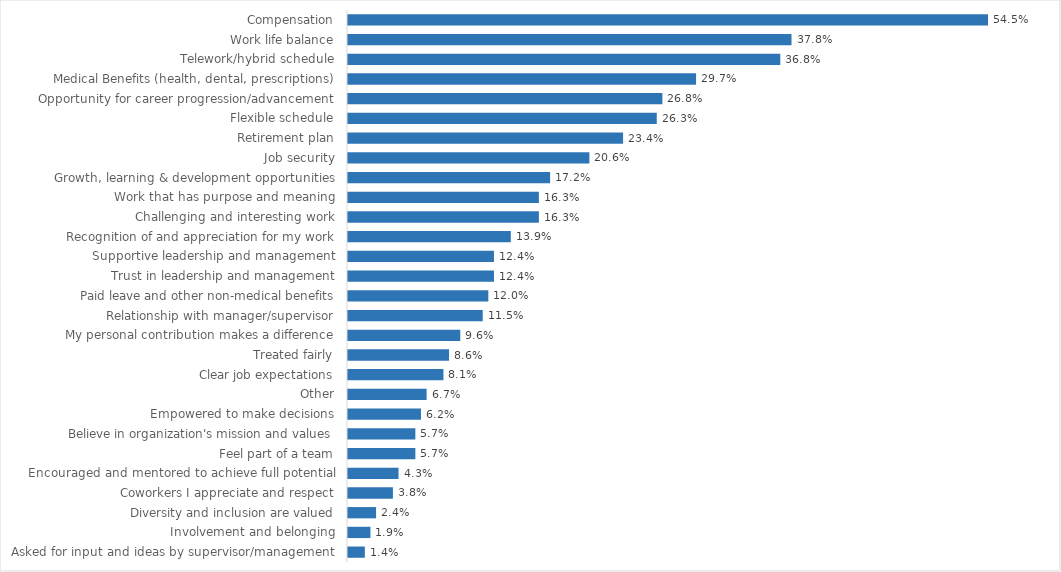
| Category | Labor |
|---|---|
| Compensation | 0.545 |
| Work life balance | 0.378 |
| Telework/hybrid schedule | 0.368 |
| Medical Benefits (health, dental, prescriptions) | 0.297 |
| Opportunity for career progression/advancement | 0.268 |
| Flexible schedule | 0.263 |
| Retirement plan | 0.234 |
| Job security | 0.206 |
| Growth, learning & development opportunities | 0.172 |
| Work that has purpose and meaning | 0.163 |
| Challenging and interesting work | 0.163 |
| Recognition of and appreciation for my work | 0.139 |
| Supportive leadership and management | 0.124 |
| Trust in leadership and management | 0.124 |
| Paid leave and other non-medical benefits | 0.12 |
| Relationship with manager/supervisor | 0.115 |
| My personal contribution makes a difference | 0.096 |
| Treated fairly | 0.086 |
| Clear job expectations | 0.081 |
| Other | 0.067 |
| Empowered to make decisions | 0.062 |
| Believe in organization's mission and values | 0.057 |
| Feel part of a team | 0.057 |
| Encouraged and mentored to achieve full potential | 0.043 |
| Coworkers I appreciate and respect | 0.038 |
| Diversity and inclusion are valued | 0.024 |
| Involvement and belonging | 0.019 |
| Asked for input and ideas by supervisor/management | 0.014 |